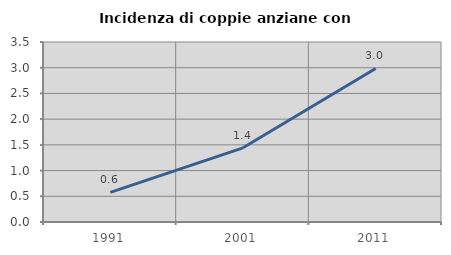
| Category | Incidenza di coppie anziane con figli |
|---|---|
| 1991.0 | 0.575 |
| 2001.0 | 1.442 |
| 2011.0 | 2.985 |